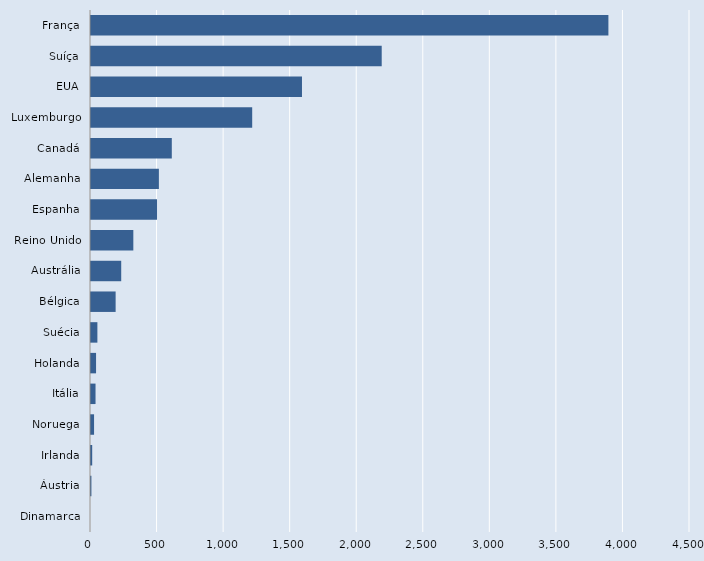
| Category | Series 0 |
|---|---|
| Dinamarca | 0 |
| Áustria | 3 |
| Irlanda | 9 |
| Noruega | 23 |
| Itália | 34 |
| Holanda | 38 |
| Suécia | 48 |
| Bélgica | 185 |
| Austrália | 227 |
| Reino Unido | 318 |
| Espanha | 496 |
| Alemanha | 510 |
| Canadá | 607 |
| Luxemburgo | 1211 |
| EUA | 1585 |
| Suíça | 2184 |
| França | 3887 |